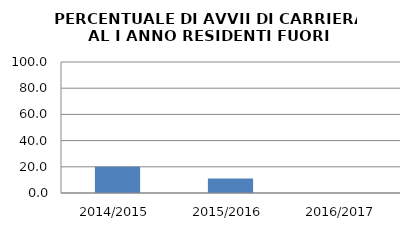
| Category | 2014/2015 2015/2016 2016/2017 |
|---|---|
| 2014/2015 | 20 |
| 2015/2016 | 11.111 |
| 2016/2017 | 0 |